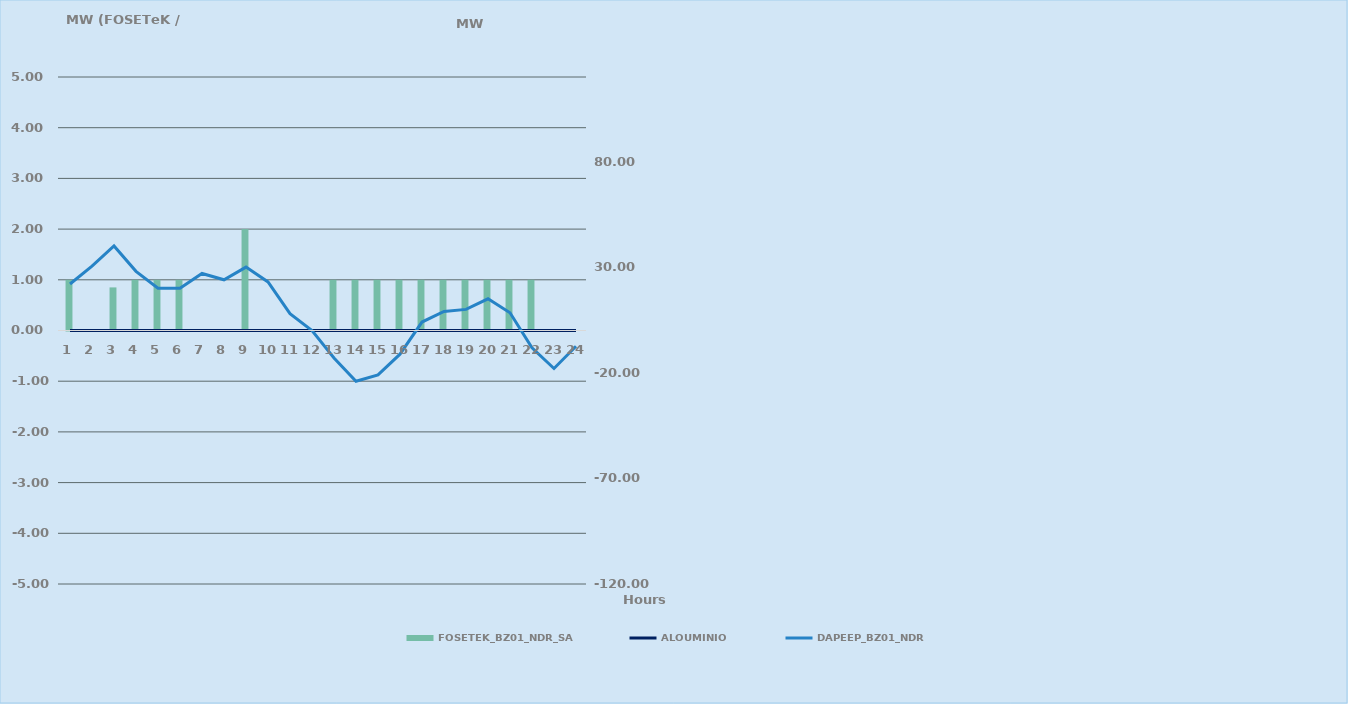
| Category | FOSETEK_BZ01_NDR_SA |
|---|---|
| 0 | 1 |
| 1 | 0 |
| 2 | 0.85 |
| 3 | 1 |
| 4 | 1 |
| 5 | 1 |
| 6 | 0 |
| 7 | 0 |
| 8 | 2 |
| 9 | 0 |
| 10 | 0 |
| 11 | 0 |
| 12 | 1 |
| 13 | 1 |
| 14 | 1 |
| 15 | 1 |
| 16 | 1 |
| 17 | 1 |
| 18 | 1 |
| 19 | 1 |
| 20 | 1 |
| 21 | 1 |
| 22 | 0 |
| 23 | 0 |